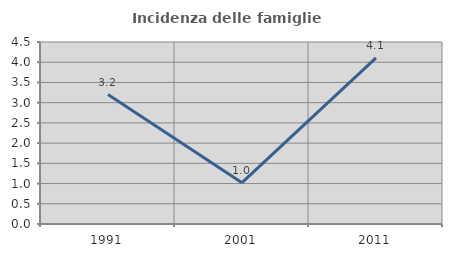
| Category | Incidenza delle famiglie numerose |
|---|---|
| 1991.0 | 3.2 |
| 2001.0 | 1.023 |
| 2011.0 | 4.107 |